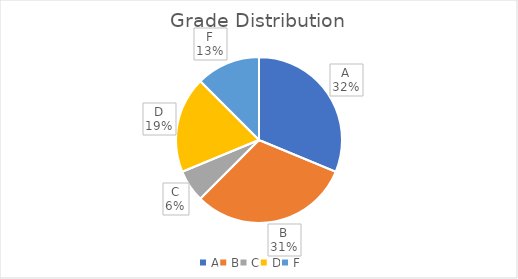
| Category | Series 0 |
|---|---|
| A | 5 |
| B | 5 |
| C | 1 |
| D | 3 |
| F | 2 |